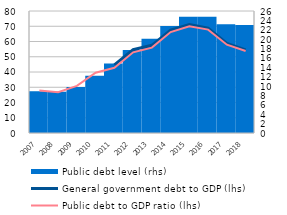
| Category | Public debt level (rhs) |
|---|---|
| 2007 | 8.9 |
| 2008 | 8.8 |
| 2009 | 9.8 |
| 2010 | 12.2 |
| 2011 | 14.8 |
| 2012 | 17.7 |
| 2013 | 20.1 |
| 2014 | 22.8 |
| 2015 | 24.8 |
| 2016 | 24.8 |
| 2017 | 23.2 |
| 2018 | 23 |